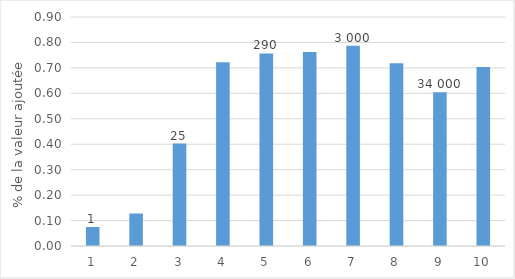
| Category | Part de la valeur ajoutée du décile |
|---|---|
| 1.0 | 0.075 |
| 2.0 | 0.128 |
| 3.0 | 0.403 |
| 4.0 | 0.722 |
| 5.0 | 0.757 |
| 6.0 | 0.763 |
| 7.0 | 0.787 |
| 8.0 | 0.718 |
| 9.0 | 0.604 |
| 10.0 | 0.704 |